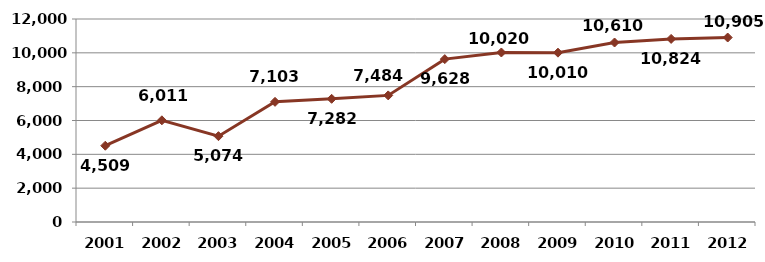
| Category | Series 0 |
|---|---|
| 2001.0 | 4509 |
| 2002.0 | 6011 |
| 2003.0 | 5074 |
| 2004.0 | 7103 |
| 2005.0 | 7282 |
| 2006.0 | 7484 |
| 2007.0 | 9628 |
| 2008.0 | 10020 |
| 2009.0 | 10010 |
| 2010.0 | 10610 |
| 2011.0 | 10824 |
| 2012.0 | 10905 |